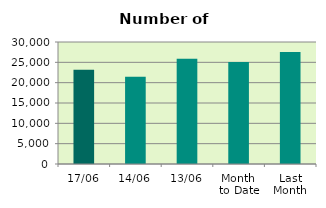
| Category | Series 0 |
|---|---|
| 17/06 | 23186 |
| 14/06 | 21470 |
| 13/06 | 25860 |
| Month 
to Date | 25067.455 |
| Last
Month | 27522.455 |